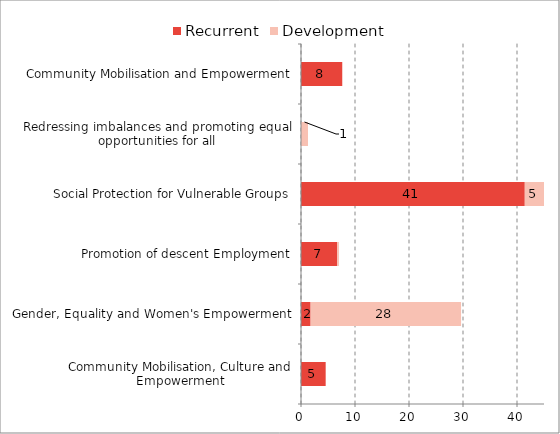
| Category | Recurrent | Development |
|---|---|---|
| Community Mobilisation, Culture and Empowerment | 4.57 | 0 |
| Gender, Equality and Women's Empowerment | 1.78 | 27.86 |
| Promotion of descent Employment | 6.72 | 0.3 |
| Social Protection for Vulnerable Groups | 41.44 | 4.62 |
| Redressing imbalances and promoting equal opportunities for all | 0 | 1.3 |
| Community Mobilisation and Empowerment | 7.64 | 0 |